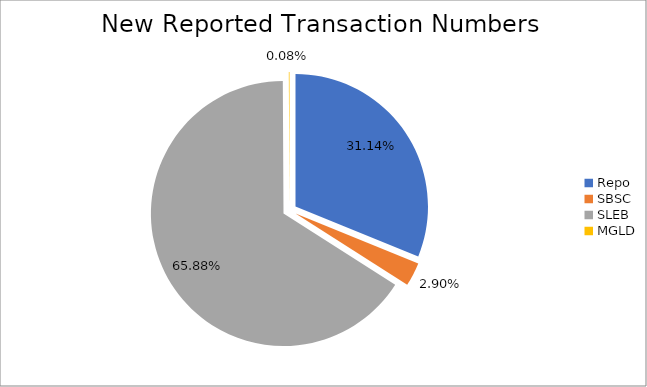
| Category | Series 0 |
|---|---|
| Repo | 379944 |
| SBSC | 35347 |
| SLEB | 803670 |
| MGLD | 1019 |